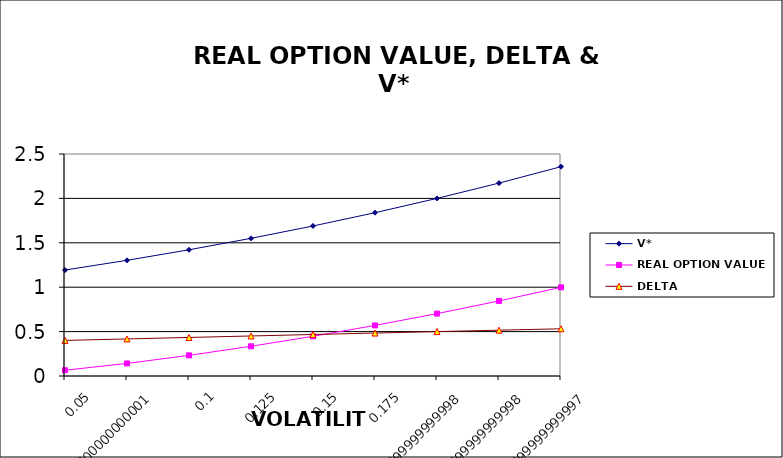
| Category | V* | REAL OPTION VALUE | DELTA |
|---|---|---|---|
| 0.05 | 1.193 | 0.065 | 0.401 |
| 0.07500000000000001 | 1.303 | 0.142 | 0.417 |
| 0.1 | 1.422 | 0.232 | 0.434 |
| 0.125 | 1.55 | 0.335 | 0.451 |
| 0.15 | 1.689 | 0.447 | 0.467 |
| 0.175 | 1.839 | 0.57 | 0.484 |
| 0.19999999999999998 | 2 | 0.703 | 0.5 |
| 0.22499999999999998 | 2.173 | 0.845 | 0.516 |
| 0.24999999999999997 | 2.357 | 0.999 | 0.532 |